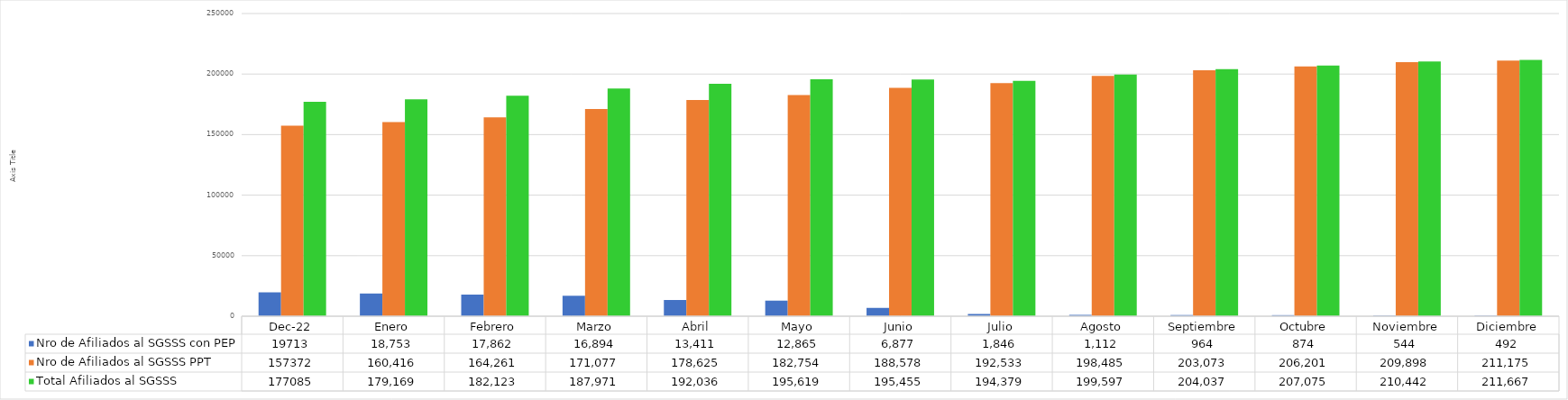
| Category | Nro de Afiliados al SGSSS con PEP | Nro de Afiliados al SGSSS PPT | Total Afiliados al SGSSS |
|---|---|---|---|
| dic-22 | 19713 | 157372 | 177085 |
| Enero | 18753 | 160416 | 179169 |
| Febrero | 17862 | 164261 | 182123 |
| Marzo | 16894 | 171077 | 187971 |
| Abril | 13411 | 178625 | 192036 |
| Mayo | 12865 | 182754 | 195619 |
| Junio | 6877 | 188578 | 195455 |
| Julio | 1846 | 192533 | 194379 |
| Agosto | 1112 | 198485 | 199597 |
| Septiembre | 964 | 203073 | 204037 |
| Octubre | 874 | 206201 | 207075 |
| Noviembre | 544 | 209898 | 210442 |
| Diciembre | 492 | 211175 | 211667 |